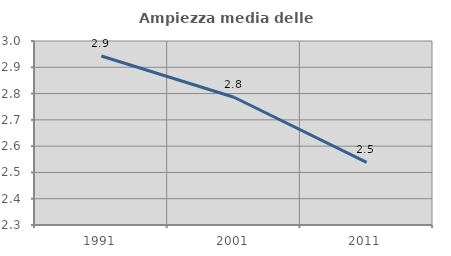
| Category | Ampiezza media delle famiglie |
|---|---|
| 1991.0 | 2.943 |
| 2001.0 | 2.786 |
| 2011.0 | 2.538 |